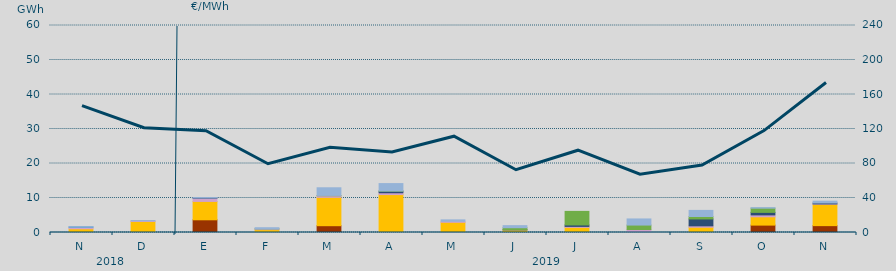
| Category | Carbón | Ciclo Combinado | Consumo Bombeo | Enlace Península Baleares | Eólica | Hidráulica | Internacionales | Otras Renovables | Solar fotovoltaica | Solar térmica | Turbinación bombeo |
|---|---|---|---|---|---|---|---|---|---|---|---|
| N | 0 | 1082.6 | 481.8 | 0 | 0 | 0 | 2.8 | 0 | 0 | 0 | 84 |
| D | 0 | 3205.2 | 176.9 | 0 | 0 | 0 | 0 | 0 | 0 | 0 | 86.6 |
| E | 3682 | 5322.9 | 938.4 | 84 | 0 | 0 | 0 | 0 | 0 | 0 | 101.3 |
| F | 0 | 833.4 | 213.9 | 0 | 0 | 20 | 0 | 0 | 0 | 0 | 316.9 |
| M | 1971 | 8220.1 | 457 | 0 | 0 | 93.4 | 0 | 0 | 0 | 0 | 2222.8 |
| A | 0 | 10989.2 | 526.4 | 464.9 | 0 | 36.7 | 0 | 0 | 0 | 0 | 2160.3 |
| M | 0 | 2953.6 | 298.3 | 0 | 0 | 0 | 0 | 0 | 0 | 0 | 406.3 |
| J | 0 | 740 | 46.8 | 0.2 | 0 | 591.6 | 0 | 0 | 0 | 0 | 608.6 |
| J | 0 | 1487.2 | 278 | 427 | 0 | 3925.5 | 0 | 0 | 0 | 0 | 0 |
| A | 0 | 3 | 860.8 | 0 | 0 | 1293.4 | 0 | 0 | 0 | 0 | 1772.4 |
| S | 0 | 1521.8 | 407.7 | 1996.9 | 0 | 704.6 | 0 | 0 | 0 | 0 | 1776.1 |
| O | 2142 | 2403.7 | 557.8 | 729 | 0 | 1220 | 0 | 0 | 0 | 0 | 154.4 |
| N | 1990 | 6178.7 | 123 | 256 | 0 | 0 | 0 | 0 | 0 | 0 | 528.8 |